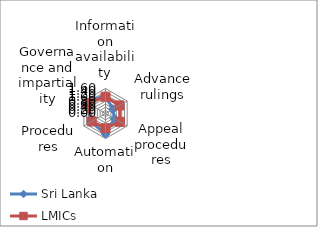
| Category | Sri Lanka | LMICs |
|---|---|---|
| Information availability | 1.143 | 1.071 |
| Advance rulings | 0.545 | 1.034 |
| Appeal procedures | 0.667 | 1.074 |
| Automation | 1.308 | 0.94 |
| Procedures | 1.067 | 1.013 |
| Governance and impartiality | 1.444 | 1.307 |